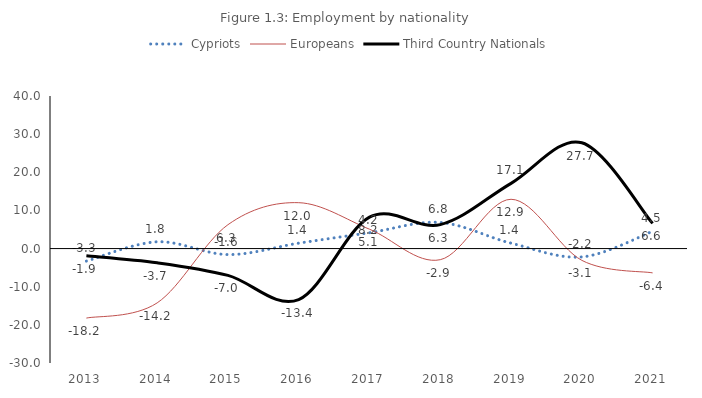
| Category | Cypriots | Europeans | Third Country Nationals |
|---|---|---|---|
| 2013.0 | -3.29 | -18.222 | -1.88 |
| 2014.0 | 1.775 | -14.237 | -3.719 |
| 2015.0 | -1.572 | 6.259 | -7.033 |
| 2016.0 | 1.417 | 12.032 | -13.366 |
| 2017.0 | 4.157 | 5.075 | 8.24 |
| 2018.0 | 6.843 | -2.918 | 6.279 |
| 2019.0 | 1.42 | 12.921 | 17.102 |
| 2020.0 | -2.196 | -3.089 | 27.743 |
| 2021.0 | 4.512 | -6.373 | 6.604 |